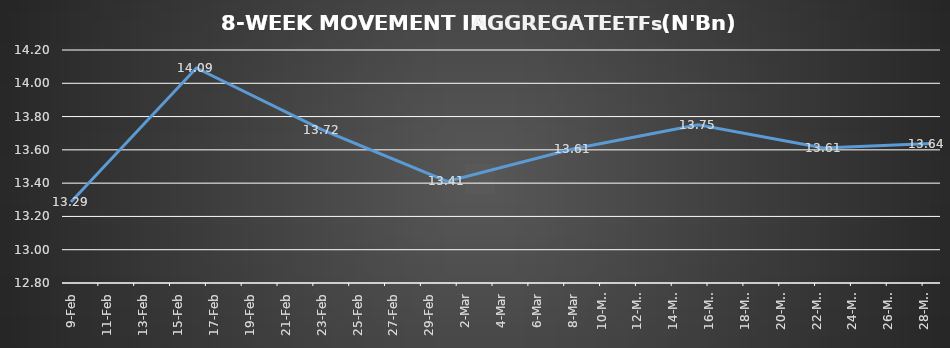
| Category | ETFs AGGREGATE |
|---|---|
| 2024-02-09 | 13.287 |
| 2024-02-16 | 14.092 |
| 2024-02-23 | 13.721 |
| 2024-03-01 | 13.41 |
| 2024-03-08 | 13.605 |
| 2024-03-15 | 13.75 |
| 2024-03-22 | 13.612 |
| 2024-03-28 | 13.638 |